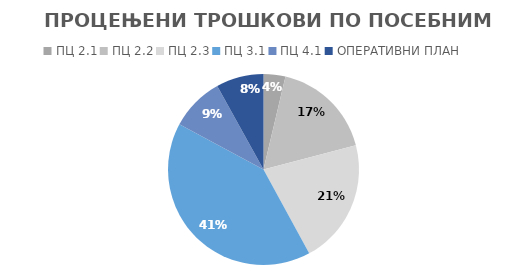
| Category | Series 0 |
|---|---|
| ПЦ 2.1 | 73871.39 |
| ПЦ 2.2 | 343586.1 |
| ПЦ 2.3 | 422122.658 |
| ПЦ 3.1 | 814095.716 |
| ПЦ 4.1 | 181694.805 |
| ОПЕРАТИВНИ ПЛАН | 160700.05 |